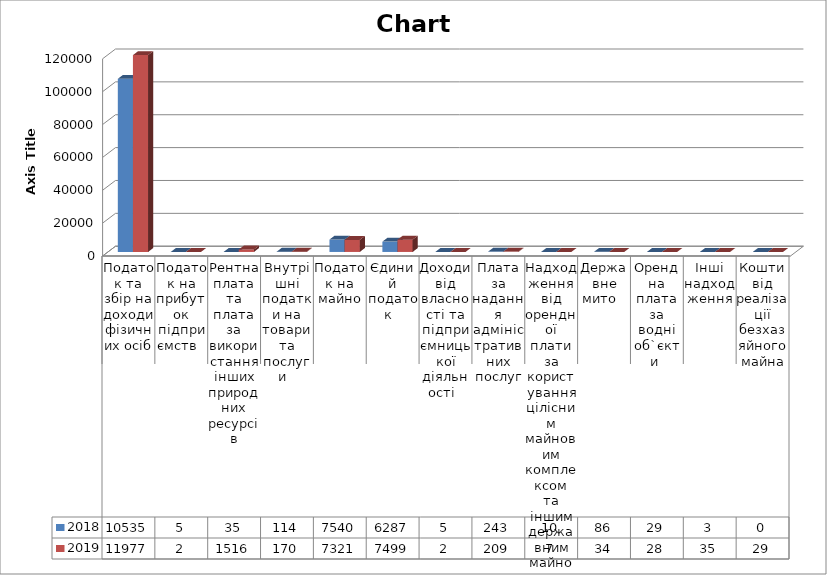
| Category | 2018 | 2019 |
|---|---|---|
| Податок та збір на доходи фізичних осіб | 105353 | 119774.7 |
| Податок на прибуток підприємств   | 4.9 | 2.2 |
| Рентна плата та плата за використання інших природних ресурсів | 34.8 | 1515.9 |
| Внутрішні податки на товари та послуги   | 114 | 170.1 |
| Податок на майно | 7540 | 7320.5 |
| Єдиний податок   | 6287 | 7499 |
| Доходи від власності та підприємницької діяльності   | 4.8 | 2.2 |
| Плата за надання адміністративних послуг | 243 | 209 |
| Надходження від орендної плати за користування цілісним майновим комплексом та іншим державним майном   | 10 | 6.6 |
| Державне мито   | 86.1 | 34.3 |
| Орендна плата за водні об`єкти  | 29.3 | 27.5 |
| Інші надходження   | 2.5 | 35.3 |
| Кошти від реалізації безхазяйного майна | 0 | 29 |